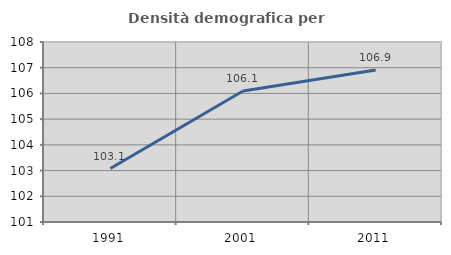
| Category | Densità demografica |
|---|---|
| 1991.0 | 103.078 |
| 2001.0 | 106.093 |
| 2011.0 | 106.91 |